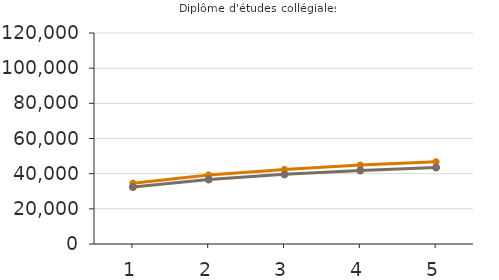
| Category | Moyens | Médians |
|---|---|---|
| 1.0 | 34600 | 32400 |
| 2.0 | 39300 | 36700 |
| 3.0 | 42400 | 39600 |
| 4.0 | 44900 | 41800 |
| 5.0 | 46800 | 43500 |